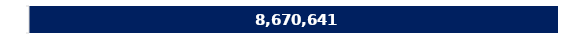
| Category | Potential Demand |
|---|---|
| 0 | 8670641.289 |